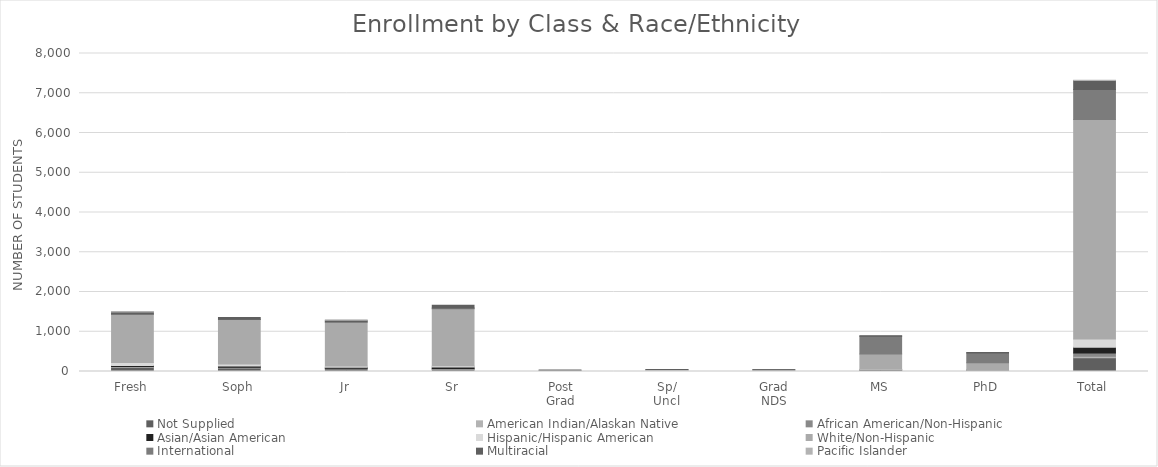
| Category | Not Supplied | American Indian/Alaskan Native | African American/Non-Hispanic | Asian/Asian American | Hispanic/Hispanic American | White/Non-Hispanic | International | Multiracial | Pacific Islander |
|---|---|---|---|---|---|---|---|---|---|
| Fresh | 102 | 9 | 17 | 26 | 71 | 1208 | 21 | 44 | 3 |
| Soph | 85 | 11 | 12 | 29 | 50 | 1119 | 6 | 47 | 0 |
| Jr | 71 | 3 | 8 | 23 | 31 | 1105 | 8 | 42 | 1 |
| Sr | 55 | 5 | 14 | 40 | 30 | 1436 | 17 | 71 | 0 |
| Post
Grad | 0 | 0 | 0 | 0 | 0 | 29 | 1 | 1 | 0 |
| Sp/
Uncl | 3 | 1 | 2 | 5 | 3 | 36 | 1 | 1 | 0 |
| Grad
NDS | 1 | 1 | 4 | 1 | 1 | 36 | 1 | 1 | 0 |
| MS | 12 | 4 | 17 | 11 | 12 | 384 | 449 | 10 | 0 |
| PhD | 18 | 3 | 6 | 12 | 7 | 172 | 250 | 8 | 0 |
| Total | 347 | 37 | 80 | 147 | 205 | 5525 | 754 | 225 | 4 |